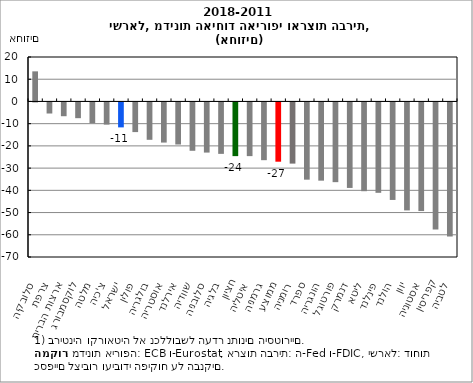
| Category | שיעור השינוי המצטבר במספר הסניפים 2011-2018 |
|---|---|
| סלובקיה | 13.54 |
| צרפת | -4.98 |
| ארצות הברית | -6.199 |
| לוקסמבורג | -7.08 |
| מלטה | -9.346 |
| צ'כיה | -9.976 |
| ישראל | -11.224 |
| פולין | -13.343 |
| בולגריה | -16.812 |
| אוסטריה | -18.055 |
| אירלנד | -18.926 |
| שוודיה | -21.756 |
| סלובניה | -22.562 |
| בלגיה | -23.138 |
| חציון | -24.156 |
| איטליה | -24.156 |
| גרמניה | -25.98 |
| ממוצע | -26.668 |
| רומניה | -27.522 |
| ספרד | -34.753 |
| הונגריה | -35.199 |
| פורטוגל | -35.871 |
| דנמרק | -38.471 |
| ליטא | -39.941 |
| פינלנד | -40.664 |
| הולנד | -43.875 |
| יוון | -48.583 |
| אסטוניה | -48.876 |
| קפריסין | -57.206 |
| לטביה | -60.291 |